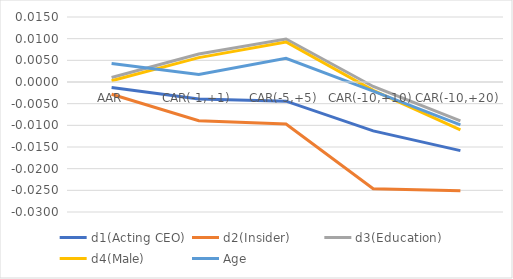
| Category | d1(Acting CEO) | d2(Insider) | d3(Education) | d4(Male) | Age |
|---|---|---|---|---|---|
| AAR | -0.001 | -0.003 | 0.001 | 0 | 0.004 |
| CAR(-1,+1) | -0.004 | -0.009 | 0.006 | 0.006 | 0.002 |
| CAR(-5,+5) | -0.004 | -0.01 | 0.01 | 0.009 | 0.005 |
| CAR(-10,+10) | -0.011 | -0.025 | -0.001 | -0.002 | -0.002 |
| CAR(-10,+20) | -0.016 | -0.025 | -0.009 | -0.011 | -0.01 |